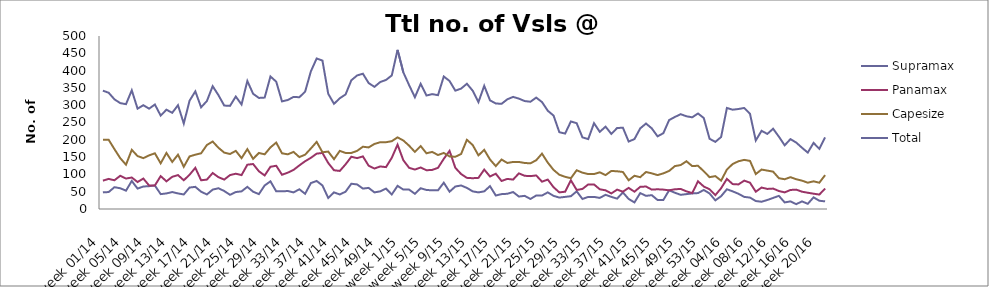
| Category | Supramax | Panamax | Capesize | Total |
|---|---|---|---|---|
| week 01/14 | 48 | 82 | 200 | 342 |
| week 02/14 | 49 | 87 | 200 | 336 |
| week 03/14 | 63 | 83 | 173 | 317 |
| week 04/14 | 60 | 96 | 147 | 306 |
| week 05/14 | 53 | 88 | 128 | 303 |
| week 06/14 | 81 | 91 | 171 | 343 |
| week 07/14 | 59 | 78 | 153 | 290 |
| week 08/14 | 65 | 88 | 147 | 300 |
| week 09/14 | 66 | 68 | 155 | 290 |
| week 10/14 | 68 | 68 | 161 | 302 |
| week 11/14 | 43 | 95 | 132 | 270 |
| week 12/14 | 45 | 80 | 162 | 287 |
| week 13/14 | 49 | 93 | 136 | 278 |
| week 14/14 | 45 | 98 | 157 | 300 |
| week 15/14 | 42 | 83 | 122 | 247 |
| week 16/14 | 62 | 99 | 152 | 313 |
| week 17/14 | 64 | 119 | 157 | 340 |
| week 18/14 | 50 | 83 | 161 | 294 |
| week 19/14 | 42 | 85 | 185 | 312 |
| week 20/14 | 56 | 104 | 195 | 355 |
| week 21/14 | 60 | 92 | 177 | 329 |
| week 22/14 | 52 | 85 | 163 | 299 |
| week 23/14 | 41 | 98 | 159 | 298 |
| week 24/14 | 49 | 102 | 168 | 325 |
| week 25/14 | 51 | 98 | 147 | 302 |
| week 26/14 | 64 | 128 | 173 | 370 |
| week 27/14 | 50 | 130 | 145 | 333 |
| week 28/14 | 43 | 109 | 162 | 321 |
| week 29/14 | 68 | 97 | 158 | 322 |
| week 30/14 | 80 | 122 | 178 | 383 |
| week 31/14 | 51 | 125 | 192 | 368 |
| week 32/14 | 51 | 99 | 161 | 311 |
| week 33/14 | 52 | 105 | 158 | 315 |
| week 34/14 | 48 | 113 | 165 | 324 |
| week 35/14 | 57 | 126 | 150 | 323 |
| week 36/14 | 44 | 138 | 157 | 339 |
| week 37/14 | 75 | 148 | 175 | 398 |
| week 38/14 | 81 | 160 | 194 | 435 |
| week 39/14 | 68 | 162 | 164 | 429 |
| week 40/14 | 32 | 133 | 166 | 333 |
| week 41/14 | 48 | 112 | 144 | 304 |
| week 42/14 | 42 | 110 | 168 | 320 |
| week 43/14 | 50 | 129 | 162 | 331 |
| week 44/14 | 73 | 151 | 162 | 372 |
| week 45/14 | 71 | 147 | 168 | 386 |
| week 46/14 | 59 | 152 | 180 | 391 |
| week 47/14 | 61 | 125 | 178 | 364 |
| week 48/14 | 48 | 117 | 188 | 353 |
| week 49/14 | 51 | 123 | 193 | 367 |
| week 50/14 | 59 | 121 | 193 | 373 |
| week 51/14 | 42 | 148 | 196 | 386 |
| week 52/14 | 67 | 186 | 207 | 460 |
| week 1/15 | 56 | 141 | 198 | 395 |
| week 2/15 | 56 | 119 | 183 | 358 |
| week 3/15 | 44 | 114 | 165 | 323 |
| week 4/15 | 60 | 120 | 182 | 362 |
| week 5/15 | 55 | 112 | 161 | 328 |
| week 6/15 | 54 | 113 | 165 | 332 |
| week 7/15 | 54 | 119 | 156 | 329 |
| week 8/15 | 76 | 145 | 162 | 383 |
| week 9/15 | 50 | 168 | 152 | 370 |
| week 10/15 | 65 | 119 | 151 | 342 |
| week 11/15 | 68 | 101 | 159 | 348 |
| week 12/15 | 61 | 90 | 200 | 362 |
| week 13/15 | 51 | 89 | 185 | 342 |
| week 14/15 | 48 | 90 | 155 | 309 |
| week 15/15 | 51 | 114 | 171 | 356 |
| week 16/15 | 66 | 94 | 143 | 314 |
| week 17/15 | 39 | 102 | 124 | 305 |
| week 18/15 | 43 | 81 | 143 | 304 |
| week 19/15 | 44 | 87 | 133 | 317 |
| week 20/15 | 49 | 85 | 136 | 324 |
| week 21/15 | 36 | 103 | 136 | 319 |
| week 22/15 | 38 | 96 | 133 | 312 |
| week 23/15 | 29 | 95 | 132 | 310 |
| week 24/15 | 39 | 97 | 141 | 322 |
| week 25/15 | 39 | 79 | 160 | 309 |
| week 26/15 | 48 | 85 | 134 | 284 |
| week 27/15 | 38 | 63 | 113 | 270 |
| week 28/15 | 33 | 48 | 99 | 222 |
| week 29/15 | 35 | 50 | 93 | 218 |
| week 30/15 | 37 | 83 | 89 | 253 |
| week 31/15 | 51 | 55 | 112 | 248 |
| week 32/15 | 29 | 58 | 105 | 207 |
| week 33/15 | 35 | 71 | 101 | 202 |
| week 34/15 | 35 | 71 | 101 | 248 |
| week 35/15 | 32 | 57 | 106 | 223 |
| week 36/15 | 41 | 54 | 98 | 238 |
| week 37/15 | 35 | 45 | 110 | 217 |
| week 38/15 | 30 | 56 | 109 | 234 |
| week 39/15 | 48 | 50 | 107 | 235 |
| week 40/15 | 29 | 61 | 83 | 195 |
| week 41/15 | 19 | 50 | 96 | 202 |
| week 42/15 | 46 | 64 | 92 | 233 |
| week 43/15 | 38 | 65 | 107 | 247 |
| week 44/15 | 40 | 56 | 103 | 233 |
| week 45/15 | 26 | 57 | 98 | 210 |
| week 46/15 | 26 | 56 | 103 | 219 |
| week 47/15 | 54 | 54 | 110 | 257 |
| week 48/15 | 47 | 57 | 124 | 266 |
| week 49/15 | 41 | 58 | 127 | 274 |
| week 50/15 | 43 | 51 | 138 | 268 |
| week 51/15 | 45 | 46 | 124 | 265 |
| week 52/15 | 46 | 80 | 125 | 276 |
| week 53/15 | 55 | 65 | 109 | 263 |
| week 01/16 | 45 | 57 | 92 | 203 |
| week 02/16 | 25 | 40 | 95 | 194 |
| week 03/16 | 37 | 60 | 82 | 208 |
| week 04/16 | 57 | 87 | 114 | 292 |
| week 05/16 | 51 | 72 | 130 | 287 |
| week 06/16 | 44 | 71 | 138 | 289 |
| week 07/16 | 35 | 82 | 142 | 292 |
| week 08/16 | 33 | 76 | 139 | 275 |
| week 09/16 | 23 | 50 | 101 | 198 |
| week 10/16 | 21 | 62 | 114 | 226 |
| week 11/16 | 26 | 58 | 111 | 217 |
| week 12/16 | 32 | 59 | 108 | 232 |
| week 13/16 | 38 | 52 | 89 | 209 |
| week 14/16 | 19 | 48 | 86 | 184 |
| week 15/16 | 22 | 55 | 92 | 202 |
| week 16/16 | 14 | 56 | 86 | 192 |
| week 17/16 | 22 | 50 | 82 | 177 |
| week 18/16 | 15 | 47 | 76 | 163 |
| week 19/16 | 33.625 | 44.2 | 80 | 191 |
| week 20/16 | 23.833 | 41.75 | 76 | 173.789 |
| week 21/16 | 22 | 59 | 98 | 207 |